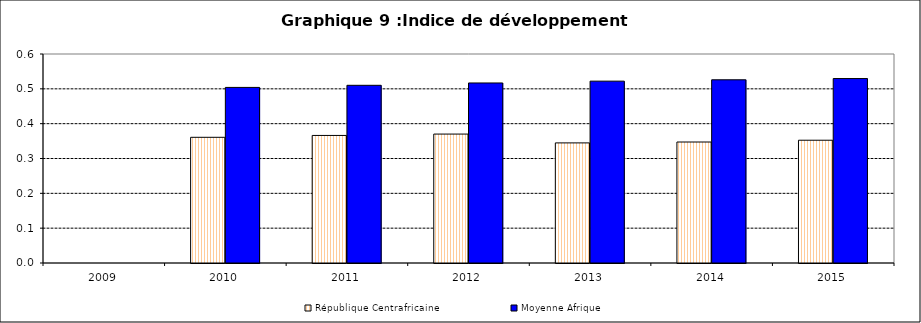
| Category | République Centrafricaine | Moyenne Afrique |
|---|---|---|
| 2009.0 | 0 | 0 |
| 2010.0 | 0.361 | 0.504 |
| 2011.0 | 0.366 | 0.51 |
| 2012.0 | 0.37 | 0.517 |
| 2013.0 | 0.345 | 0.522 |
| 2014.0 | 0.347 | 0.526 |
| 2015.0 | 0.352 | 0.53 |